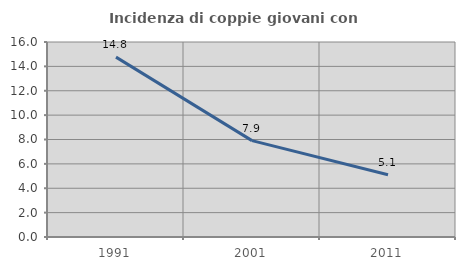
| Category | Incidenza di coppie giovani con figli |
|---|---|
| 1991.0 | 14.759 |
| 2001.0 | 7.906 |
| 2011.0 | 5.104 |